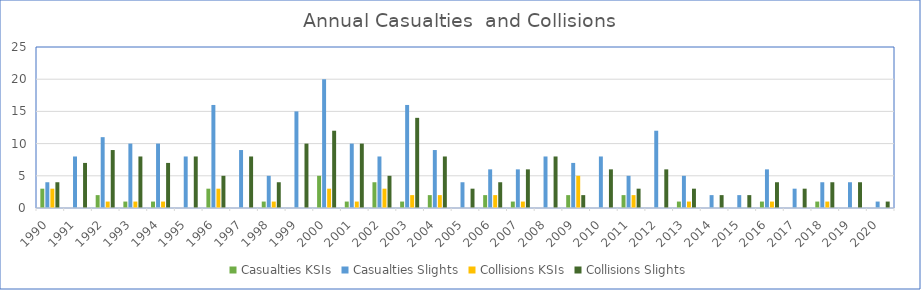
| Category | Casualties | Collisions |
|---|---|---|
| 1990.0 | 4 | 4 |
| 1991.0 | 8 | 7 |
| 1992.0 | 11 | 9 |
| 1993.0 | 10 | 8 |
| 1994.0 | 10 | 7 |
| 1995.0 | 8 | 8 |
| 1996.0 | 16 | 5 |
| 1997.0 | 9 | 8 |
| 1998.0 | 5 | 4 |
| 1999.0 | 15 | 10 |
| 2000.0 | 20 | 12 |
| 2001.0 | 10 | 10 |
| 2002.0 | 8 | 5 |
| 2003.0 | 16 | 14 |
| 2004.0 | 9 | 8 |
| 2005.0 | 4 | 3 |
| 2006.0 | 6 | 4 |
| 2007.0 | 6 | 6 |
| 2008.0 | 8 | 8 |
| 2009.0 | 7 | 2 |
| 2010.0 | 8 | 6 |
| 2011.0 | 5 | 3 |
| 2012.0 | 12 | 6 |
| 2013.0 | 5 | 3 |
| 2014.0 | 2 | 2 |
| 2015.0 | 2 | 2 |
| 2016.0 | 6 | 4 |
| 2017.0 | 3 | 3 |
| 2018.0 | 4 | 4 |
| 2019.0 | 4 | 4 |
| 2020.0 | 1 | 1 |